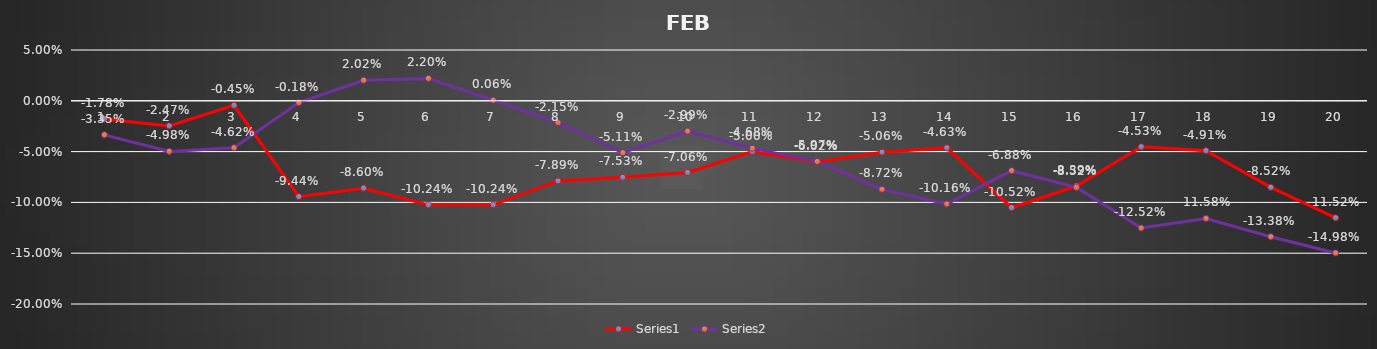
| Category | Series 0 | Series 1 |
|---|---|---|
| 0 | -0.018 | -0.034 |
| 1 | -0.025 | -0.05 |
| 2 | -0.004 | -0.046 |
| 3 | -0.094 | -0.002 |
| 4 | -0.086 | 0.02 |
| 5 | -0.102 | 0.022 |
| 6 | -0.102 | 0.001 |
| 7 | -0.079 | -0.022 |
| 8 | -0.075 | -0.051 |
| 9 | -0.071 | -0.03 |
| 10 | -0.05 | -0.047 |
| 11 | -0.06 | -0.06 |
| 12 | -0.051 | -0.087 |
| 13 | -0.046 | -0.102 |
| 14 | -0.105 | -0.069 |
| 15 | -0.084 | -0.085 |
| 16 | -0.045 | -0.125 |
| 17 | -0.049 | -0.116 |
| 18 | -0.085 | -0.134 |
| 19 | -0.115 | -0.15 |